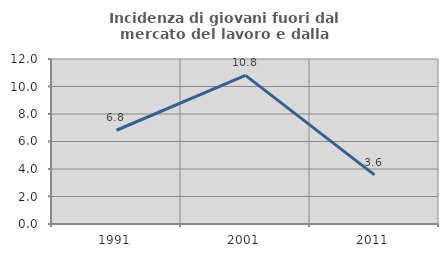
| Category | Incidenza di giovani fuori dal mercato del lavoro e dalla formazione  |
|---|---|
| 1991.0 | 6.818 |
| 2001.0 | 10.811 |
| 2011.0 | 3.571 |